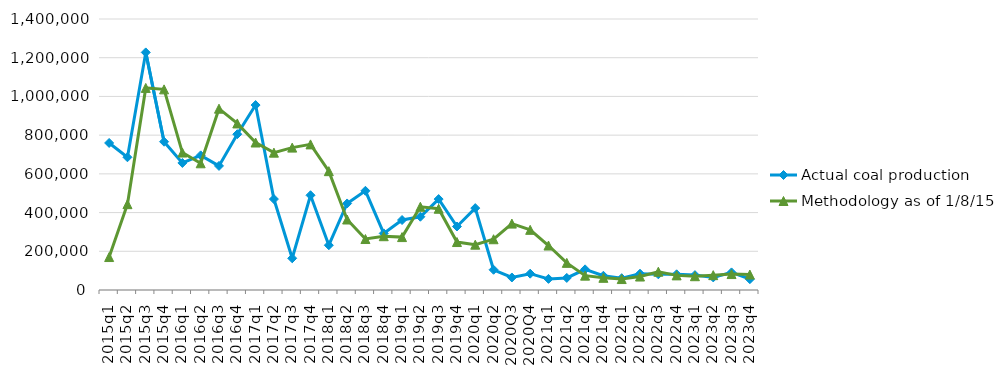
| Category | Actual coal production | Methodology as of 1/8/15 |
|---|---|---|
| 2015q1 | 759590 | 170292 |
| 2015q2 | 685670 | 443416 |
| 2015q3 | 1227419 | 1043875 |
| 2015q4 | 766049 | 1036518 |
| 2016q1 | 656288 | 710052 |
| 2016q2 | 695520 | 654558 |
| 2016q3 | 641033 | 936748 |
| 2016q4 | 804815 | 860462 |
| 2017q1 | 955465 | 761956 |
| 2017q2 | 469765 | 709573 |
| 2017q3 | 163904 | 735551 |
| 2017q4 | 489433 | 752202 |
| 2018q1 | 231304 | 613948 |
| 2018q2 | 447032 | 364134 |
| 2018q3 | 512470 | 263385 |
| 2018q4 | 292435 | 277847 |
| 2019q1 | 361468 | 273332 |
| 2019q2 | 378501 | 429791 |
| 2019q3 | 469699 | 419764 |
| 2019q4 | 328001 | 247760 |
| 2020q1 | 423130 | 234107 |
| 2020q2 | 104459 | 262181 |
| 2020Q3 | 64684 | 343046 |
| 2020Q4 | 84309 | 310788 |
| 2021q1 | 57440 | 229719 |
| 2021q2 | 62374 | 140142 |
| 2021q3 | 106690 | 74247 |
| 2021q4 | 73589 | 62929 |
| 2022q1 | 60961 | 56569 |
| 2022q2 | 84030 | 69563 |
| 2022q3 | 81035 | 94281 |
| 2022q4 | 81081 | 75532 |
| 2023q1 | 76990 | 71266 |
| 2023q2 | 65014 | 76726 |
| 2023q3 | 90844 | 82358 |
| 2023q4 | 55981 | 79827 |